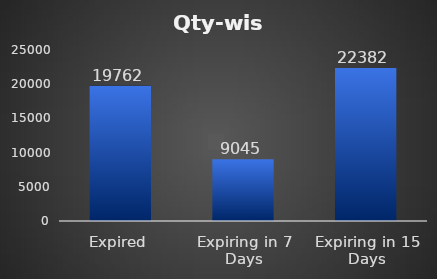
| Category | Series 0 |
|---|---|
| Expired | 19762 |
| Expiring in 7 Days | 9045 |
| Expiring in 15 Days | 22382 |